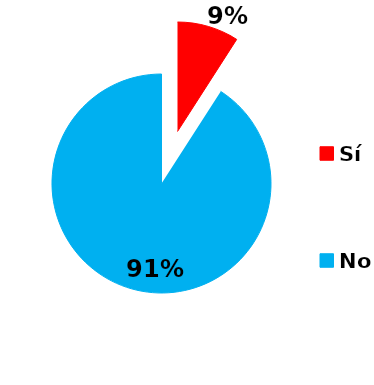
| Category | Series 0 |
|---|---|
| Sí | 8 |
| No | 80 |